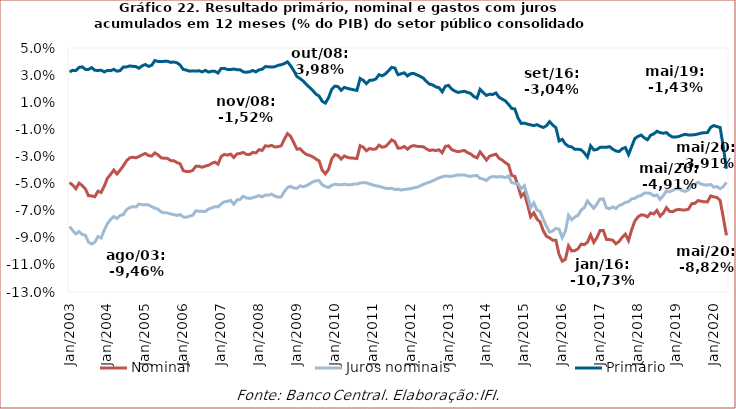
| Category | Nominal | Juros nominais | Primário |
|---|---|---|---|
| 2003-01-01 | -0.049 | -0.082 | 0.032 |
| 2003-02-01 | -0.051 | -0.085 | 0.034 |
| 2003-03-01 | -0.054 | -0.087 | 0.033 |
| 2003-04-01 | -0.05 | -0.085 | 0.036 |
| 2003-05-01 | -0.051 | -0.088 | 0.036 |
| 2003-06-01 | -0.054 | -0.088 | 0.034 |
| 2003-07-01 | -0.059 | -0.093 | 0.034 |
| 2003-08-01 | -0.059 | -0.095 | 0.036 |
| 2003-09-01 | -0.06 | -0.093 | 0.034 |
| 2003-10-01 | -0.056 | -0.089 | 0.033 |
| 2003-11-01 | -0.057 | -0.09 | 0.034 |
| 2003-12-01 | -0.052 | -0.084 | 0.032 |
| 2004-01-01 | -0.046 | -0.079 | 0.033 |
| 2004-02-01 | -0.043 | -0.076 | 0.033 |
| 2004-03-01 | -0.04 | -0.074 | 0.034 |
| 2004-04-01 | -0.043 | -0.076 | 0.033 |
| 2004-05-01 | -0.04 | -0.073 | 0.033 |
| 2004-06-01 | -0.037 | -0.073 | 0.036 |
| 2004-07-01 | -0.033 | -0.069 | 0.036 |
| 2004-08-01 | -0.031 | -0.068 | 0.037 |
| 2004-09-01 | -0.031 | -0.067 | 0.036 |
| 2004-10-01 | -0.031 | -0.067 | 0.036 |
| 2004-11-01 | -0.03 | -0.065 | 0.035 |
| 2004-12-01 | -0.029 | -0.066 | 0.037 |
| 2005-01-01 | -0.028 | -0.066 | 0.038 |
| 2005-02-01 | -0.029 | -0.066 | 0.036 |
| 2005-03-01 | -0.03 | -0.067 | 0.037 |
| 2005-04-01 | -0.027 | -0.068 | 0.041 |
| 2005-05-01 | -0.029 | -0.069 | 0.04 |
| 2005-06-01 | -0.031 | -0.071 | 0.04 |
| 2005-07-01 | -0.031 | -0.072 | 0.04 |
| 2005-08-01 | -0.031 | -0.072 | 0.04 |
| 2005-09-01 | -0.033 | -0.072 | 0.039 |
| 2005-10-01 | -0.033 | -0.073 | 0.04 |
| 2005-11-01 | -0.034 | -0.074 | 0.039 |
| 2005-12-01 | -0.035 | -0.073 | 0.037 |
| 2006-01-01 | -0.041 | -0.075 | 0.034 |
| 2006-02-01 | -0.041 | -0.075 | 0.034 |
| 2006-03-01 | -0.041 | -0.074 | 0.033 |
| 2006-04-01 | -0.04 | -0.073 | 0.033 |
| 2006-05-01 | -0.037 | -0.07 | 0.033 |
| 2006-06-01 | -0.037 | -0.07 | 0.033 |
| 2006-07-01 | -0.038 | -0.07 | 0.032 |
| 2006-08-01 | -0.037 | -0.071 | 0.034 |
| 2006-09-01 | -0.037 | -0.069 | 0.032 |
| 2006-10-01 | -0.035 | -0.068 | 0.033 |
| 2006-11-01 | -0.034 | -0.067 | 0.033 |
| 2006-12-01 | -0.036 | -0.067 | 0.032 |
| 2007-01-01 | -0.03 | -0.065 | 0.035 |
| 2007-02-01 | -0.028 | -0.063 | 0.035 |
| 2007-03-01 | -0.029 | -0.063 | 0.034 |
| 2007-04-01 | -0.028 | -0.062 | 0.034 |
| 2007-05-01 | -0.031 | -0.065 | 0.035 |
| 2007-06-01 | -0.028 | -0.062 | 0.034 |
| 2007-07-01 | -0.028 | -0.062 | 0.034 |
| 2007-08-01 | -0.027 | -0.059 | 0.032 |
| 2007-09-01 | -0.028 | -0.061 | 0.032 |
| 2007-10-01 | -0.029 | -0.061 | 0.032 |
| 2007-11-01 | -0.027 | -0.06 | 0.033 |
| 2007-12-01 | -0.027 | -0.06 | 0.032 |
| 2008-01-01 | -0.025 | -0.059 | 0.034 |
| 2008-02-01 | -0.026 | -0.06 | 0.034 |
| 2008-03-01 | -0.022 | -0.058 | 0.036 |
| 2008-04-01 | -0.022 | -0.059 | 0.036 |
| 2008-05-01 | -0.022 | -0.058 | 0.036 |
| 2008-06-01 | -0.023 | -0.059 | 0.036 |
| 2008-07-01 | -0.023 | -0.06 | 0.037 |
| 2008-08-01 | -0.022 | -0.06 | 0.038 |
| 2008-09-01 | -0.017 | -0.056 | 0.039 |
| 2008-10-01 | -0.013 | -0.053 | 0.04 |
| 2008-11-01 | -0.015 | -0.052 | 0.037 |
| 2008-12-01 | -0.02 | -0.053 | 0.033 |
| 2009-01-01 | -0.025 | -0.054 | 0.029 |
| 2009-02-01 | -0.024 | -0.052 | 0.027 |
| 2009-03-01 | -0.027 | -0.052 | 0.026 |
| 2009-04-01 | -0.029 | -0.052 | 0.023 |
| 2009-05-01 | -0.029 | -0.05 | 0.021 |
| 2009-06-01 | -0.03 | -0.049 | 0.019 |
| 2009-07-01 | -0.032 | -0.048 | 0.016 |
| 2009-08-01 | -0.033 | -0.048 | 0.015 |
| 2009-09-01 | -0.04 | -0.051 | 0.011 |
| 2009-10-01 | -0.043 | -0.052 | 0.009 |
| 2009-11-01 | -0.04 | -0.053 | 0.013 |
| 2009-12-01 | -0.032 | -0.051 | 0.019 |
| 2010-01-01 | -0.029 | -0.05 | 0.022 |
| 2010-02-01 | -0.029 | -0.051 | 0.022 |
| 2010-03-01 | -0.032 | -0.051 | 0.019 |
| 2010-04-01 | -0.03 | -0.051 | 0.021 |
| 2010-05-01 | -0.031 | -0.051 | 0.02 |
| 2010-06-01 | -0.031 | -0.051 | 0.02 |
| 2010-07-01 | -0.031 | -0.05 | 0.019 |
| 2010-08-01 | -0.032 | -0.05 | 0.019 |
| 2010-09-01 | -0.022 | -0.05 | 0.028 |
| 2010-10-01 | -0.023 | -0.049 | 0.026 |
| 2010-11-01 | -0.026 | -0.049 | 0.024 |
| 2010-12-01 | -0.024 | -0.05 | 0.026 |
| 2011-01-01 | -0.025 | -0.051 | 0.026 |
| 2011-02-01 | -0.024 | -0.052 | 0.027 |
| 2011-03-01 | -0.022 | -0.052 | 0.03 |
| 2011-04-01 | -0.023 | -0.053 | 0.029 |
| 2011-05-01 | -0.023 | -0.053 | 0.031 |
| 2011-06-01 | -0.02 | -0.054 | 0.033 |
| 2011-07-01 | -0.018 | -0.054 | 0.036 |
| 2011-08-01 | -0.019 | -0.054 | 0.035 |
| 2011-09-01 | -0.024 | -0.054 | 0.03 |
| 2011-10-01 | -0.024 | -0.055 | 0.031 |
| 2011-11-01 | -0.023 | -0.054 | 0.032 |
| 2011-12-01 | -0.025 | -0.054 | 0.029 |
| 2012-01-01 | -0.023 | -0.054 | 0.031 |
| 2012-02-01 | -0.022 | -0.053 | 0.031 |
| 2012-03-01 | -0.023 | -0.053 | 0.03 |
| 2012-04-01 | -0.023 | -0.052 | 0.029 |
| 2012-05-01 | -0.023 | -0.051 | 0.028 |
| 2012-06-01 | -0.024 | -0.05 | 0.025 |
| 2012-07-01 | -0.026 | -0.049 | 0.023 |
| 2012-08-01 | -0.025 | -0.048 | 0.023 |
| 2012-09-01 | -0.026 | -0.047 | 0.021 |
| 2012-10-01 | -0.025 | -0.046 | 0.021 |
| 2012-11-01 | -0.027 | -0.045 | 0.018 |
| 2012-12-01 | -0.023 | -0.044 | 0.022 |
| 2013-01-01 | -0.022 | -0.045 | 0.022 |
| 2013-02-01 | -0.025 | -0.045 | 0.02 |
| 2013-03-01 | -0.026 | -0.044 | 0.018 |
| 2013-04-01 | -0.027 | -0.044 | 0.017 |
| 2013-05-01 | -0.026 | -0.044 | 0.018 |
| 2013-06-01 | -0.026 | -0.044 | 0.018 |
| 2013-07-01 | -0.027 | -0.044 | 0.017 |
| 2013-08-01 | -0.028 | -0.045 | 0.016 |
| 2013-09-01 | -0.03 | -0.044 | 0.014 |
| 2013-10-01 | -0.031 | -0.044 | 0.013 |
| 2013-11-01 | -0.027 | -0.046 | 0.02 |
| 2013-12-01 | -0.03 | -0.047 | 0.017 |
| 2014-01-01 | -0.033 | -0.048 | 0.015 |
| 2014-02-01 | -0.03 | -0.046 | 0.016 |
| 2014-03-01 | -0.029 | -0.045 | 0.016 |
| 2014-04-01 | -0.028 | -0.045 | 0.017 |
| 2014-05-01 | -0.031 | -0.045 | 0.014 |
| 2014-06-01 | -0.033 | -0.045 | 0.012 |
| 2014-07-01 | -0.035 | -0.046 | 0.011 |
| 2014-08-01 | -0.036 | -0.044 | 0.008 |
| 2014-09-01 | -0.044 | -0.049 | 0.005 |
| 2014-10-01 | -0.045 | -0.05 | 0.005 |
| 2014-11-01 | -0.052 | -0.05 | -0.002 |
| 2014-12-01 | -0.06 | -0.054 | -0.006 |
| 2015-01-01 | -0.057 | -0.052 | -0.005 |
| 2015-02-01 | -0.065 | -0.059 | -0.006 |
| 2015-03-01 | -0.074 | -0.068 | -0.007 |
| 2015-04-01 | -0.072 | -0.064 | -0.007 |
| 2015-05-01 | -0.076 | -0.07 | -0.007 |
| 2015-06-01 | -0.078 | -0.071 | -0.008 |
| 2015-07-01 | -0.085 | -0.076 | -0.009 |
| 2015-08-01 | -0.089 | -0.082 | -0.007 |
| 2015-09-01 | -0.09 | -0.086 | -0.004 |
| 2015-10-01 | -0.092 | -0.085 | -0.007 |
| 2015-11-01 | -0.092 | -0.083 | -0.009 |
| 2015-12-01 | -0.102 | -0.084 | -0.019 |
| 2016-01-01 | -0.107 | -0.09 | -0.017 |
| 2016-02-01 | -0.106 | -0.085 | -0.021 |
| 2016-03-01 | -0.096 | -0.073 | -0.023 |
| 2016-04-01 | -0.1 | -0.077 | -0.023 |
| 2016-05-01 | -0.099 | -0.075 | -0.025 |
| 2016-06-01 | -0.098 | -0.073 | -0.025 |
| 2016-07-01 | -0.095 | -0.07 | -0.025 |
| 2016-08-01 | -0.095 | -0.068 | -0.027 |
| 2016-09-01 | -0.093 | -0.063 | -0.03 |
| 2016-10-01 | -0.088 | -0.066 | -0.022 |
| 2016-11-01 | -0.093 | -0.068 | -0.025 |
| 2016-12-01 | -0.09 | -0.065 | -0.025 |
| 2017-01-01 | -0.085 | -0.061 | -0.023 |
| 2017-02-01 | -0.085 | -0.061 | -0.023 |
| 2017-03-01 | -0.091 | -0.068 | -0.023 |
| 2017-04-01 | -0.091 | -0.069 | -0.023 |
| 2017-05-01 | -0.092 | -0.067 | -0.025 |
| 2017-06-01 | -0.094 | -0.068 | -0.026 |
| 2017-07-01 | -0.093 | -0.066 | -0.026 |
| 2017-08-01 | -0.09 | -0.065 | -0.024 |
| 2017-09-01 | -0.087 | -0.064 | -0.023 |
| 2017-10-01 | -0.092 | -0.063 | -0.029 |
| 2017-11-01 | -0.084 | -0.061 | -0.023 |
| 2017-12-01 | -0.078 | -0.061 | -0.017 |
| 2018-01-01 | -0.075 | -0.059 | -0.015 |
| 2018-02-01 | -0.073 | -0.059 | -0.014 |
| 2018-03-01 | -0.073 | -0.057 | -0.016 |
| 2018-04-01 | -0.075 | -0.057 | -0.018 |
| 2018-05-01 | -0.072 | -0.057 | -0.014 |
| 2018-06-01 | -0.072 | -0.059 | -0.013 |
| 2018-07-01 | -0.07 | -0.058 | -0.011 |
| 2018-08-01 | -0.074 | -0.062 | -0.012 |
| 2018-09-01 | -0.072 | -0.059 | -0.013 |
| 2018-10-01 | -0.068 | -0.055 | -0.012 |
| 2018-11-01 | -0.071 | -0.056 | -0.014 |
| 2018-12-01 | -0.071 | -0.055 | -0.016 |
| 2019-01-01 | -0.069 | -0.054 | -0.016 |
| 2019-02-01 | -0.069 | -0.054 | -0.015 |
| 2019-03-01 | -0.07 | -0.055 | -0.014 |
| 2019-04-01 | -0.069 | -0.056 | -0.014 |
| 2019-05-01 | -0.069 | -0.055 | -0.014 |
| 2019-06-01 | -0.065 | -0.051 | -0.014 |
| 2019-07-01 | -0.065 | -0.051 | -0.014 |
| 2019-08-01 | -0.063 | -0.049 | -0.013 |
| 2019-09-01 | -0.063 | -0.05 | -0.013 |
| 2019-10-01 | -0.063 | -0.051 | -0.012 |
| 2019-11-01 | -0.064 | -0.051 | -0.012 |
| 2019-12-01 | -0.059 | -0.051 | -0.009 |
| 2020-01-01 | -0.06 | -0.053 | -0.007 |
| 2020-02-01 | -0.06 | -0.052 | -0.008 |
| 2020-03-01 | -0.062 | -0.054 | -0.009 |
| 2020-04-01 | -0.075 | -0.052 | -0.023 |
| 2020-05-01 | -0.088 | -0.049 | -0.039 |